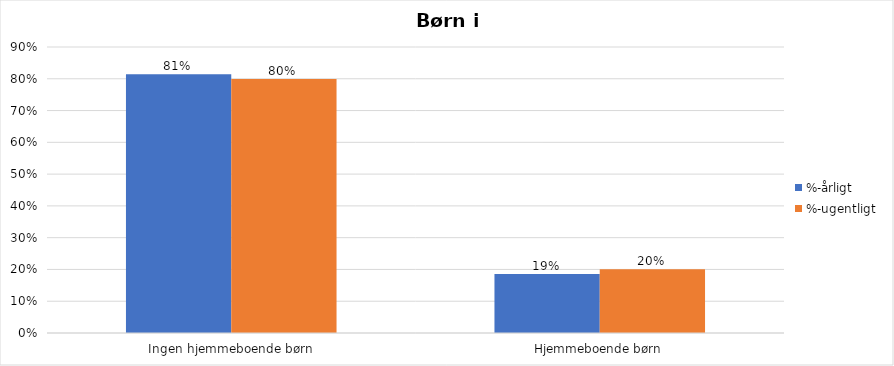
| Category | %-årligt | %-ugentligt |
|---|---|---|
| Ingen hjemmeboende børn | 0.814 | 0.799 |
| Hjemmeboende børn | 0.186 | 0.201 |